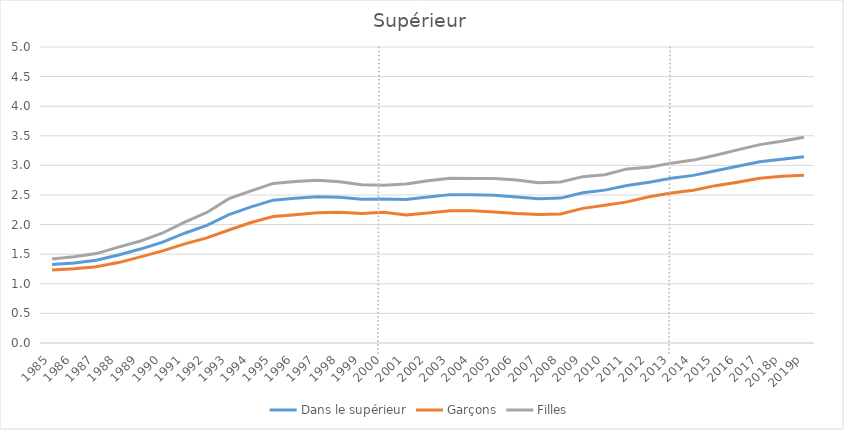
| Category | Dans le supérieur | Garçons | Filles |
|---|---|---|---|
| 1985 | 1.326 | 1.235 | 1.42 |
| 1986 | 1.353 | 1.253 | 1.456 |
| 1987 | 1.397 | 1.288 | 1.511 |
| 1988 | 1.487 | 1.358 | 1.62 |
| 1989 | 1.587 | 1.456 | 1.722 |
| 1990 | 1.705 | 1.556 | 1.858 |
| 1991 | 1.854 | 1.674 | 2.04 |
| 1992 | 1.988 | 1.776 | 2.205 |
| 1993 | 2.17 | 1.908 | 2.438 |
| 1994 | 2.299 | 2.036 | 2.57 |
| 1995 | 2.413 | 2.137 | 2.696 |
| 1996 | 2.445 | 2.167 | 2.729 |
| 1997 | 2.47 | 2.199 | 2.749 |
| 1998 | 2.462 | 2.208 | 2.723 |
| 1999 | 2.428 | 2.19 | 2.672 |
| 2000 | 2.434 | 2.208 | 2.664 |
| 2001 | 2.422 | 2.163 | 2.685 |
| 2002 | 2.467 | 2.196 | 2.741 |
| 2003 | 2.506 | 2.232 | 2.783 |
| 2004 | 2.504 | 2.233 | 2.779 |
| 2005 | 2.495 | 2.215 | 2.781 |
| 2006 | 2.466 | 2.186 | 2.752 |
| 2007 | 2.435 | 2.169 | 2.706 |
| 2008 | 2.448 | 2.181 | 2.72 |
| 2009 | 2.539 | 2.274 | 2.81 |
| 2010 | 2.582 | 2.328 | 2.843 |
| 2011 | 2.659 | 2.383 | 2.941 |
| 2012 | 2.715 | 2.469 | 2.968 |
| 2013 | 2.782 | 2.534 | 3.038 |
| 2014 | 2.831 | 2.581 | 3.09 |
| 2015 | 2.911 | 2.658 | 3.171 |
| 2016 | 2.985 | 2.716 | 3.263 |
| 2017 | 3.061 | 2.782 | 3.351 |
| 2018p | 3.105 | 2.816 | 3.407 |
| 2019p | 3.147 | 2.832 | 3.476 |